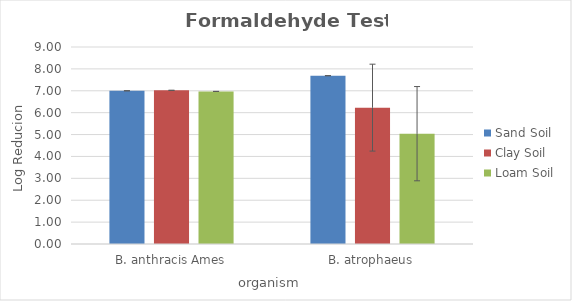
| Category | Sand Soil | Clay Soil | Loam Soil |
|---|---|---|---|
| B. anthracis Ames | 7 | 7.02 | 6.97 |
| B. atrophaeus | 7.69 | 6.23 | 5.04 |